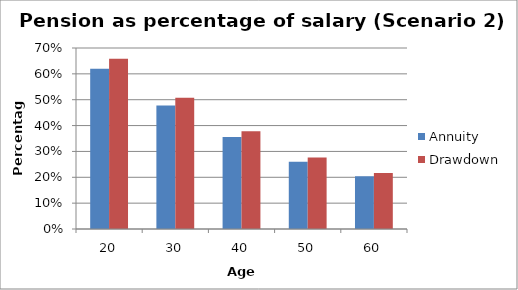
| Category | Annuity | Drawdown |
|---|---|---|
| 20.0 | 0.62 | 0.659 |
| 30.0 | 0.478 | 0.508 |
| 40.0 | 0.356 | 0.378 |
| 50.0 | 0.26 | 0.277 |
| 60.0 | 0.204 | 0.217 |